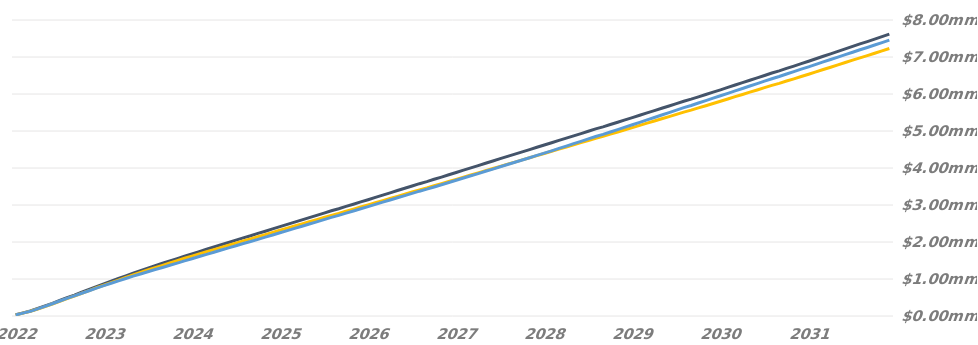
| Category | Cumulative Interest |
|---|---|
| 2022-06-27 | 30000 |
| 2022-07-27 | 77159.525 |
| 2022-08-27 | 126834.011 |
| 2022-09-27 | 190763.699 |
| 2022-10-27 | 260258.293 |
| 2022-11-27 | 331041.262 |
| 2022-12-27 | 404620.106 |
| 2023-01-27 | 478244.159 |
| 2023-02-27 | 544644.409 |
| 2023-03-27 | 614795.687 |
| 2023-04-27 | 682682.77 |
| 2023-05-27 | 752834.048 |
| 2023-06-27 | 820722.694 |
| 2023-07-27 | 885392.999 |
| 2023-08-27 | 950063.305 |
| 2023-09-27 | 1012646.43 |
| 2023-10-27 | 1077316.735 |
| 2023-11-27 | 1135522.673 |
| 2023-12-27 | 1195669.949 |
| 2024-01-27 | 1255815.848 |
| 2024-02-27 | 1312080.48 |
| 2024-03-27 | 1372226.809 |
| 2024-04-27 | 1430432.747 |
| 2024-05-27 | 1490580.023 |
| 2024-06-27 | 1548785.96 |
| 2024-07-27 | 1607961.559 |
| 2024-08-27 | 1667137.588 |
| 2024-09-27 | 1724405.036 |
| 2024-10-27 | 1783581.969 |
| 2024-11-27 | 1840848.897 |
| 2024-12-27 | 1900024.495 |
| 2025-01-27 | 1959200.094 |
| 2025-02-27 | 2012648.205 |
| 2025-03-27 | 2072529.742 |
| 2025-04-27 | 2130479.378 |
| 2025-05-27 | 2190360.442 |
| 2025-06-27 | 2248310.077 |
| 2025-07-27 | 2308191.615 |
| 2025-08-27 | 2368073.152 |
| 2025-09-27 | 2426022.787 |
| 2025-10-27 | 2485903.851 |
| 2025-11-27 | 2543931.403 |
| 2025-12-27 | 2604134.566 |
| 2026-01-27 | 2664337.728 |
| 2026-02-27 | 2718716.062 |
| 2026-03-27 | 2778920.645 |
| 2026-04-27 | 2837181.999 |
| 2026-05-27 | 2897385.162 |
| 2026-06-27 | 2955645.37 |
| 2026-07-27 | 3015849.006 |
| 2026-08-27 | 3076072.792 |
| 2026-09-27 | 3134354.094 |
| 2026-10-27 | 3194577.881 |
| 2026-11-27 | 3252859.183 |
| 2026-12-27 | 3313082.969 |
| 2027-01-27 | 3373306.755 |
| 2027-02-27 | 3427701.616 |
| 2027-03-27 | 3487925.402 |
| 2027-04-27 | 3547189.881 |
| 2027-05-27 | 3608430.08 |
| 2027-06-27 | 3667694.559 |
| 2027-07-27 | 3728934.284 |
| 2027-08-27 | 3790174.483 |
| 2027-09-27 | 3849438.962 |
| 2027-10-27 | 3910680.108 |
| 2027-11-27 | 3969944.587 |
| 2027-12-27 | 4032776.119 |
| 2028-01-27 | 4095608.167 |
| 2028-02-27 | 4154387.475 |
| 2028-03-27 | 4217219.524 |
| 2028-04-27 | 4278024.472 |
| 2028-05-27 | 4340856.004 |
| 2028-06-27 | 4401661.577 |
| 2028-07-27 | 4464493.625 |
| 2028-08-27 | 4529492.272 |
| 2028-09-27 | 4592394.46 |
| 2028-10-27 | 4657393.107 |
| 2028-11-27 | 4720293.941 |
| 2028-12-27 | 4785293.147 |
| 2029-01-27 | 4850291.795 |
| 2029-02-27 | 4909001.767 |
| 2029-03-27 | 4974000.414 |
| 2029-04-27 | 5037287.237 |
| 2029-05-27 | 5103875.711 |
| 2029-06-27 | 5168316.44 |
| 2029-07-27 | 5234905.473 |
| 2029-08-27 | 5301494.506 |
| 2029-09-27 | 5365935.236 |
| 2029-10-27 | 5432523.709 |
| 2029-11-27 | 5496964.438 |
| 2029-12-27 | 5563553.472 |
| 2030-01-27 | 5630141.945 |
| 2030-02-27 | 5690287.89 |
| 2030-03-27 | 5756876.363 |
| 2030-04-27 | 5821315.738 |
| 2030-05-27 | 5887904.212 |
| 2030-06-27 | 5952343.587 |
| 2030-07-27 | 6018932.061 |
| 2030-08-27 | 6085520.534 |
| 2030-09-27 | 6149810.638 |
| 2030-10-27 | 6216243.466 |
| 2030-11-27 | 6280533.57 |
| 2030-12-27 | 6346966.398 |
| 2031-01-27 | 6413399.226 |
| 2031-02-27 | 6473402.059 |
| 2031-03-27 | 6539834.887 |
| 2031-04-27 | 6604124.991 |
| 2031-05-27 | 6670557.819 |
| 2031-06-27 | 6734846.569 |
| 2031-07-27 | 6801279.397 |
| 2031-08-27 | 6867712.225 |
| 2031-09-27 | 6932002.329 |
| 2031-10-27 | 6998435.156 |
| 2031-11-27 | 7062725.938 |
| 2031-12-27 | 7129159.325 |
| 2032-01-27 | 7195592.153 |
| 2032-02-27 | 7257739.69 |
| 2032-03-27 | 7324172.518 |
| 2032-04-27 | 7388461.268 |
| 2032-05-27 | 7454894.655 |